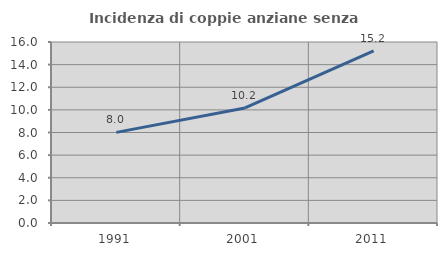
| Category | Incidenza di coppie anziane senza figli  |
|---|---|
| 1991.0 | 8.011 |
| 2001.0 | 10.172 |
| 2011.0 | 15.225 |